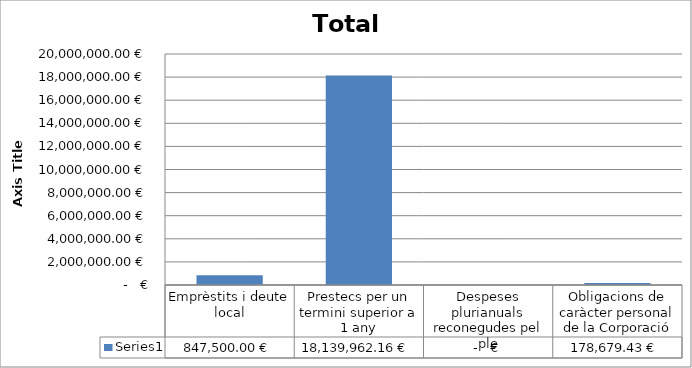
| Category | Series 0 |
|---|---|
| Emprèstits i deute local | 847500 |
| Prestecs per un termini superior a 1 any | 18139962.16 |
| Despeses plurianuals reconegudes pel ple | 0 |
| Obligacions de caràcter personal de la Corporació | 178679.43 |